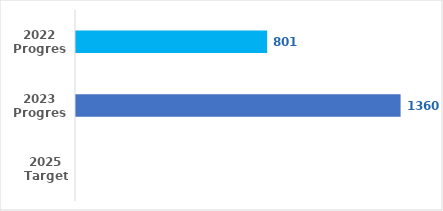
| Category | Series 0 |
|---|---|
| 2022 Progress | 801 |
| 2023 Progress | 1360 |
| 2025 Target | 0 |